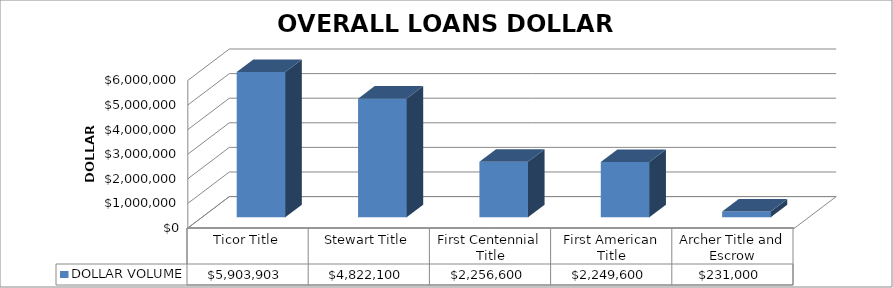
| Category | DOLLAR VOLUME |
|---|---|
| Ticor Title | 5903903 |
| Stewart Title | 4822100 |
| First Centennial Title | 2256600 |
| First American Title | 2249600 |
| Archer Title and Escrow | 231000 |